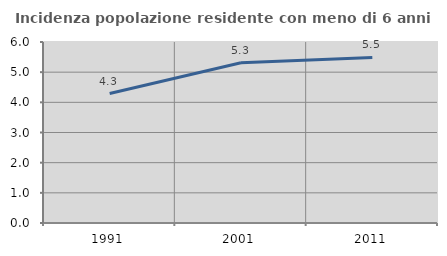
| Category | Incidenza popolazione residente con meno di 6 anni |
|---|---|
| 1991.0 | 4.292 |
| 2001.0 | 5.314 |
| 2011.0 | 5.489 |